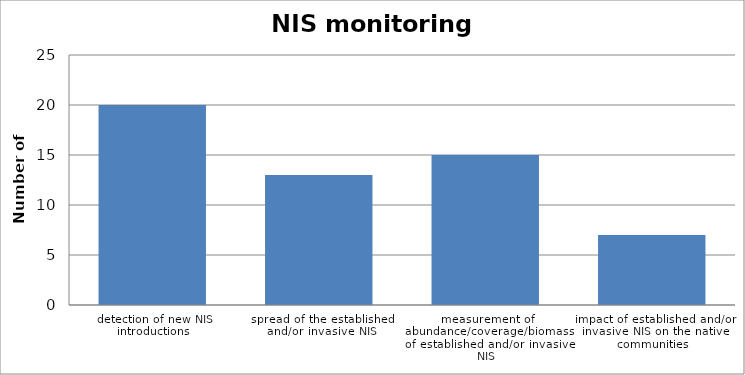
| Category | Member States |
|---|---|
| detection of new NIS introductions | 20 |
| spread of the established and/or invasive NIS | 13 |
| measurement of abundance/coverage/biomass of established and/or invasive NIS | 15 |
| impact of established and/or invasive NIS on the native communities | 7 |